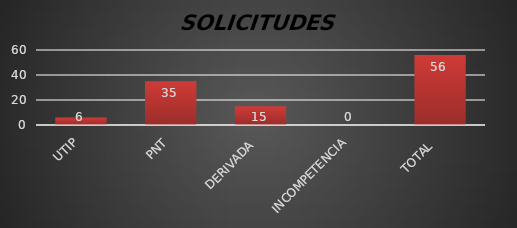
| Category | Series 1 |
|---|---|
| UTIP | 6 |
| PNT | 35 |
| DERIVADA  | 15 |
| INCOMPETENCIA | 0 |
| TOTAL  | 56 |